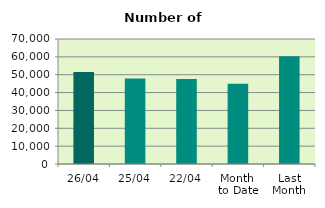
| Category | Series 0 |
|---|---|
| 26/04 | 51546 |
| 25/04 | 47902 |
| 22/04 | 47572 |
| Month 
to Date | 44875.25 |
| Last
Month | 60380.087 |